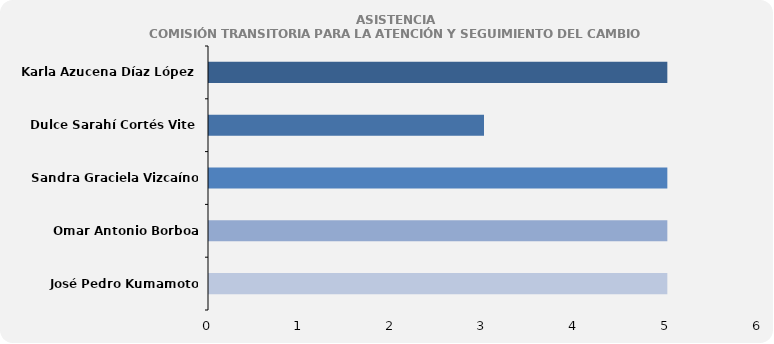
| Category | Series 0 |
|---|---|
| Karla Azucena Díaz López | 5 |
| Dulce Sarahí Cortés Vite | 3 |
| Sandra Graciela Vizcaíno Meza | 5 |
| Omar Antonio Borboa Becerra | 5 |
| José Pedro Kumamoto Aguilar | 5 |